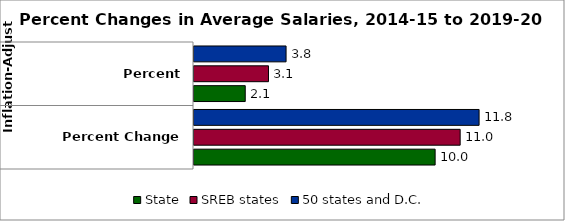
| Category | State | SREB states | 50 states and D.C. |
|---|---|---|---|
| 0 | 9.958 | 10.992 | 11.774 |
| 1 | 2.116 | 3.076 | 3.802 |